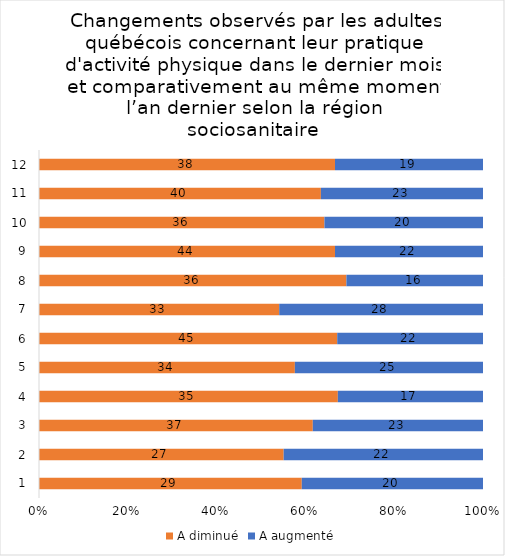
| Category | A diminué | A augmenté |
|---|---|---|
| 0 | 29 | 20 |
| 1 | 27 | 22 |
| 2 | 37 | 23 |
| 3 | 35 | 17 |
| 4 | 34 | 25 |
| 5 | 45 | 22 |
| 6 | 33 | 28 |
| 7 | 36 | 16 |
| 8 | 44 | 22 |
| 9 | 36 | 20 |
| 10 | 40 | 23 |
| 11 | 38 | 19 |